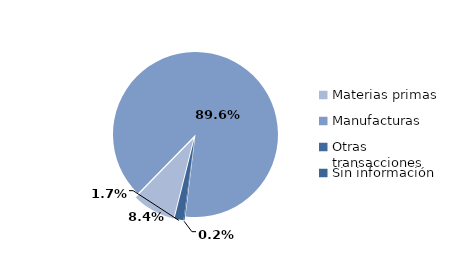
| Category | Series 0 |
|---|---|
| Materias primas | 1366.649 |
| Manufacturas | 14501.192 |
| Otras transacciones | 34.331 |
| Sin información | 282.243 |